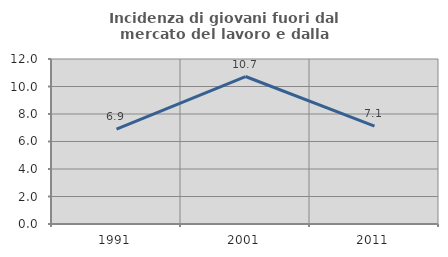
| Category | Incidenza di giovani fuori dal mercato del lavoro e dalla formazione  |
|---|---|
| 1991.0 | 6.904 |
| 2001.0 | 10.726 |
| 2011.0 | 7.113 |